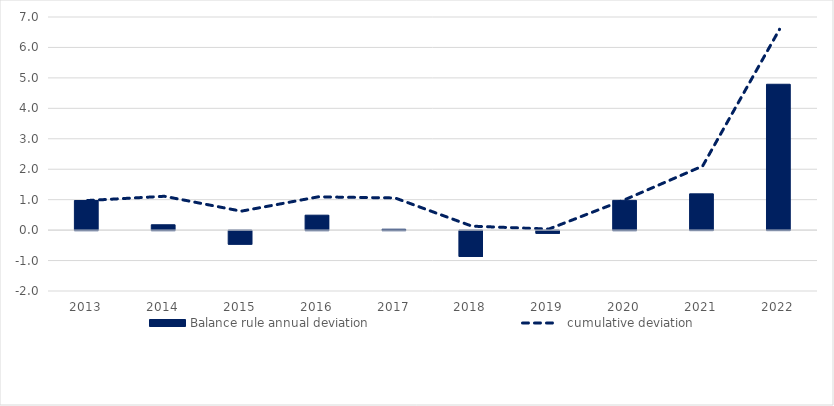
| Category | Balance rule |
|---|---|
| 2013.0 | 0.972 |
| 2014.0 | 0.176 |
| 2015.0 | -0.447 |
| 2016.0 | 0.49 |
| 2017.0 | 0.029 |
| 2018.0 | -0.848 |
| 2019.0 | -0.089 |
| 2020.0 | 0.977 |
| 2021.0 | 1.191 |
| 2022.0 | 4.791 |